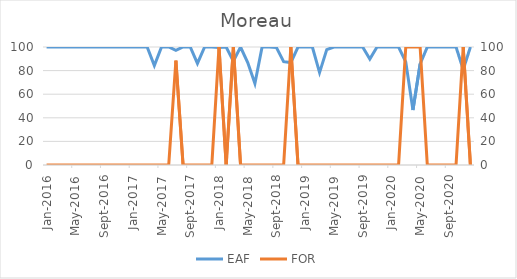
| Category | EAF |
|---|---|
| 2016-01-01 | 100 |
| 2016-02-01 | 100 |
| 2016-03-01 | 100 |
| 2016-04-01 | 100 |
| 2016-05-01 | 100 |
| 2016-06-01 | 100 |
| 2016-07-01 | 100 |
| 2016-08-01 | 100 |
| 2016-09-01 | 100 |
| 2016-10-01 | 100 |
| 2016-11-01 | 100 |
| 2016-12-01 | 100 |
| 2017-01-01 | 100 |
| 2017-02-01 | 100 |
| 2017-03-01 | 100 |
| 2017-04-01 | 84.31 |
| 2017-05-01 | 100 |
| 2017-06-01 | 100 |
| 2017-07-01 | 97.24 |
| 2017-08-01 | 100 |
| 2017-09-01 | 100 |
| 2017-10-01 | 86.06 |
| 2017-11-01 | 100 |
| 2017-12-01 | 100 |
| 2018-01-01 | 99.5 |
| 2018-02-01 | 100 |
| 2018-03-01 | 88.02 |
| 2018-04-01 | 100 |
| 2018-05-01 | 86.83 |
| 2018-06-01 | 69.03 |
| 2018-07-01 | 100 |
| 2018-08-01 | 100 |
| 2018-09-01 | 99.48 |
| 2018-10-01 | 87.56 |
| 2018-11-01 | 86.82 |
| 2018-12-01 | 100 |
| 2019-01-01 | 100 |
| 2019-02-01 | 100 |
| 2019-03-01 | 78.32 |
| 2019-04-01 | 97.78 |
| 2019-05-01 | 100 |
| 2019-06-01 | 100 |
| 2019-07-01 | 100 |
| 2019-08-01 | 100 |
| 2019-09-01 | 100 |
| 2019-10-01 | 89.8 |
| 2019-11-01 | 100 |
| 2019-12-01 | 100 |
| 2020-01-01 | 100 |
| 2020-02-01 | 100 |
| 2020-03-01 | 87.38 |
| 2020-04-01 | 46.55 |
| 2020-05-01 | 85.66 |
| 2020-06-01 | 100 |
| 2020-07-01 | 100 |
| 2020-08-01 | 100 |
| 2020-09-01 | 100 |
| 2020-10-01 | 100 |
| 2020-11-01 | 80.86 |
| 2020-12-01 | 100 |